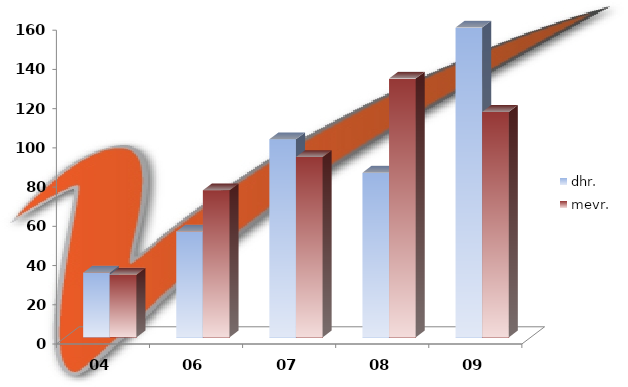
| Category | dhr. | mevr. |
|---|---|---|
| 04 | 33 | 32 |
| 06 | 54 | 75 |
| 07 | 101 | 92 |
| 08 | 84 | 132 |
| 09 | 158 | 115 |